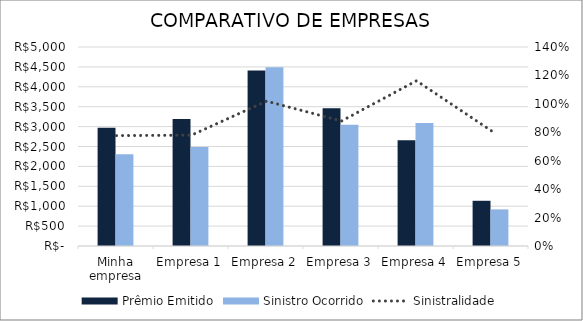
| Category | Prêmio Emitido | Sinistro Ocorrido |
|---|---|---|
| Minha empresa | 2971.4 | 2307.4 |
| Empresa 1 | 3191 | 2489 |
| Empresa 2 | 4407 | 4491 |
| Empresa 3 | 3463 | 3045 |
| Empresa 4 | 2660 | 3092 |
| Empresa 5 | 1136 | 920 |